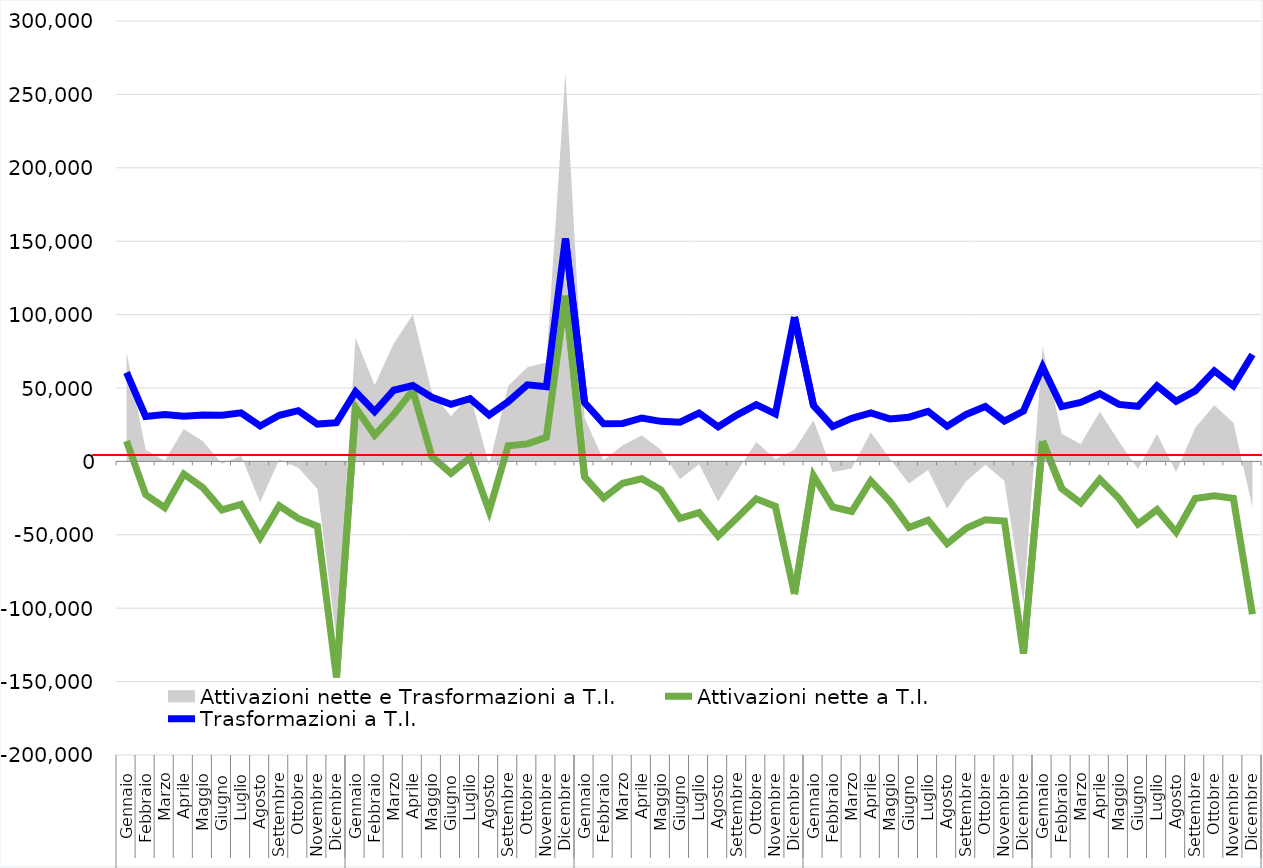
| Category | Attivazioni nette a T.I. | Trasformazioni a T.I. |
|---|---|---|
| 0 | 13801 | 60546 |
| 1 | -22614 | 30630 |
| 2 | -31506 | 31918 |
| 3 | -8593 | 30698 |
| 4 | -17931 | 31622 |
| 5 | -33079 | 31395 |
| 6 | -29219 | 33122 |
| 7 | -51907 | 24123 |
| 8 | -30231 | 31408 |
| 9 | -38837 | 34535 |
| 10 | -44103 | 25410 |
| 11 | -147156 | 26415 |
| 12 | 36671 | 47468 |
| 13 | 17937 | 33982 |
| 14 | 31926 | 48460 |
| 15 | 48245 | 51701 |
| 16 | 3178 | 43672 |
| 17 | -8238 | 38912 |
| 18 | 2562 | 42807 |
| 19 | -33811 | 31512 |
| 20 | 10661 | 40715 |
| 21 | 11939 | 52181 |
| 22 | 16373 | 50946 |
| 23 | 112884 | 151908 |
| 24 | -10591 | 40104 |
| 25 | -24945 | 25658 |
| 26 | -14888 | 25846 |
| 27 | -11876 | 29559 |
| 28 | -19344 | 27299 |
| 29 | -38851 | 26693 |
| 30 | -34848 | 32963 |
| 31 | -50828 | 23551 |
| 32 | -38410 | 31753 |
| 33 | -25518 | 38677 |
| 34 | -30675 | 32374 |
| 35 | -90391 | 98392 |
| 36 | -9821 | 37937 |
| 37 | -31006 | 23783 |
| 38 | -34117 | 29346 |
| 39 | -13254 | 33034 |
| 40 | -27143 | 28914 |
| 41 | -45103 | 30099 |
| 42 | -40010 | 34111 |
| 43 | -56048 | 23917 |
| 44 | -45530 | 32019 |
| 45 | -39771 | 37421 |
| 46 | -40637 | 27436 |
| 47 | -130950 | 34325 |
| 48 | 13772 | 64298 |
| 49 | -18412 | 37329 |
| 50 | -28288 | 40214 |
| 51 | -12218 | 46061 |
| 52 | -25173 | 38848 |
| 53 | -42637 | 37514 |
| 54 | -32828 | 51504 |
| 55 | -48241 | 41008 |
| 56 | -25232 | 48055 |
| 57 | -23358 | 61679 |
| 58 | -25207 | 51518 |
| 59 | -104108 | 72830 |